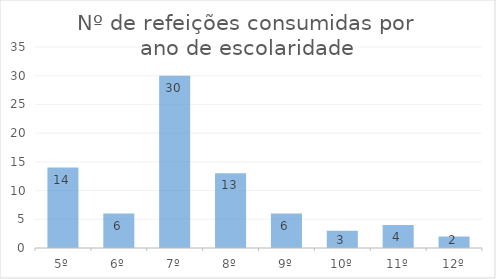
| Category |   |
|---|---|
| 5º | 14 |
| 6º | 6 |
| 7º | 30 |
| 8º | 13 |
| 9º | 6 |
| 10º | 3 |
| 11º | 4 |
| 12º | 2 |